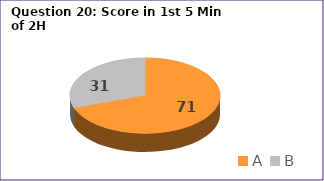
| Category | Series 0 |
|---|---|
| A | 71 |
| B | 31 |